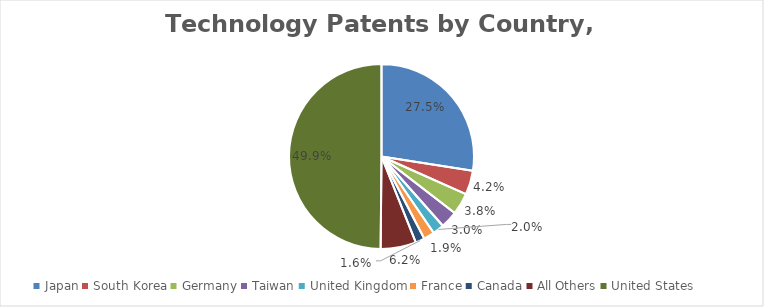
| Category | Percent |
|---|---|
| Japan | 0.275 |
| South Korea | 0.042 |
| Germany | 0.038 |
| Taiwan | 0.03 |
| United Kingdom | 0.02 |
| France | 0.019 |
| Canada | 0.016 |
| All Others | 0.062 |
| United States | 0.499 |